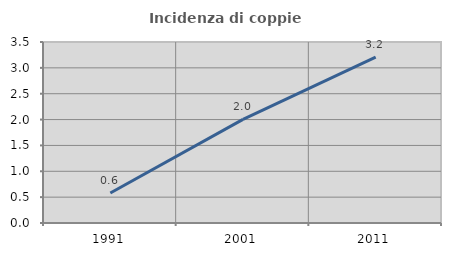
| Category | Incidenza di coppie miste |
|---|---|
| 1991.0 | 0.581 |
| 2001.0 | 2.003 |
| 2011.0 | 3.209 |